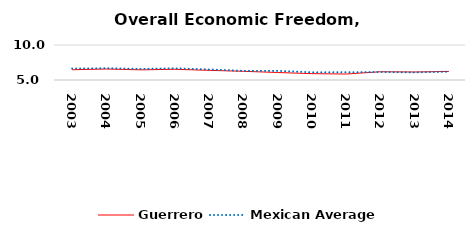
| Category | Guerrero | Mexican Average  |
|---|---|---|
| 2003.0 | 6.462 | 6.632 |
| 2004.0 | 6.571 | 6.678 |
| 2005.0 | 6.452 | 6.582 |
| 2006.0 | 6.53 | 6.668 |
| 2007.0 | 6.38 | 6.508 |
| 2008.0 | 6.242 | 6.3 |
| 2009.0 | 6.069 | 6.3 |
| 2010.0 | 5.908 | 6.105 |
| 2011.0 | 5.854 | 6.103 |
| 2012.0 | 6.178 | 6.144 |
| 2013.0 | 6.144 | 6.087 |
| 2014.0 | 6.225 | 6.195 |